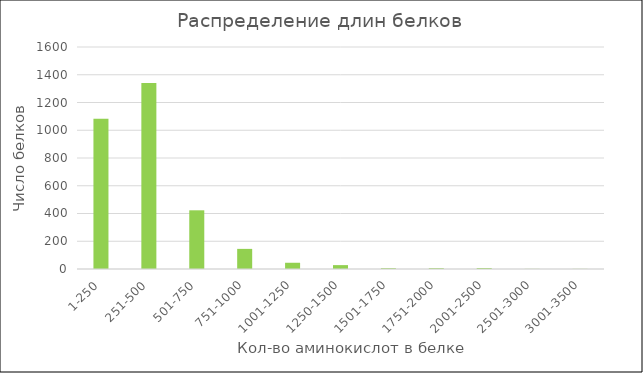
| Category | Series 0 |
|---|---|
| 1-250 | 1083 |
| 251-500 | 1340 |
| 501-750 | 423 |
| 751-1000 | 145 |
| 1001-1250 | 45 |
| 1250-1500 | 28 |
| 1501-1750 | 6 |
| 1751-2000 | 6 |
| 2001-2500 | 7 |
| 2501-3000 | 1 |
| 3001-3500 | 1 |